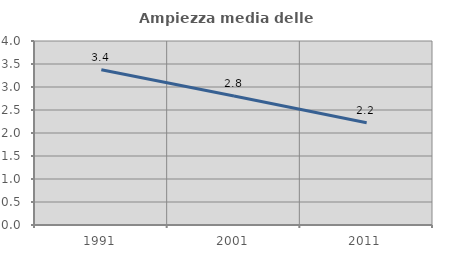
| Category | Ampiezza media delle famiglie |
|---|---|
| 1991.0 | 3.375 |
| 2001.0 | 2.802 |
| 2011.0 | 2.224 |